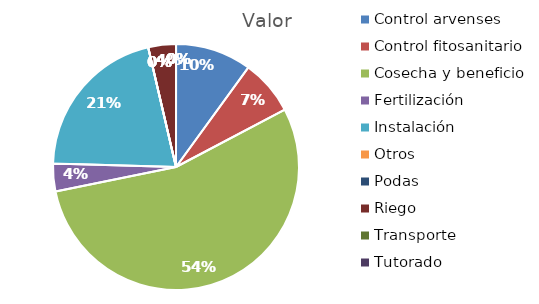
| Category | Valor |
|---|---|
| Control arvenses | 398277 |
| Control fitosanitario | 289656 |
| Cosecha y beneficio | 2170000 |
| Fertilización | 144828 |
| Instalación | 832761 |
| Otros | 0 |
| Podas | 0 |
| Riego | 144828 |
| Transporte | 0 |
| Tutorado | 0 |